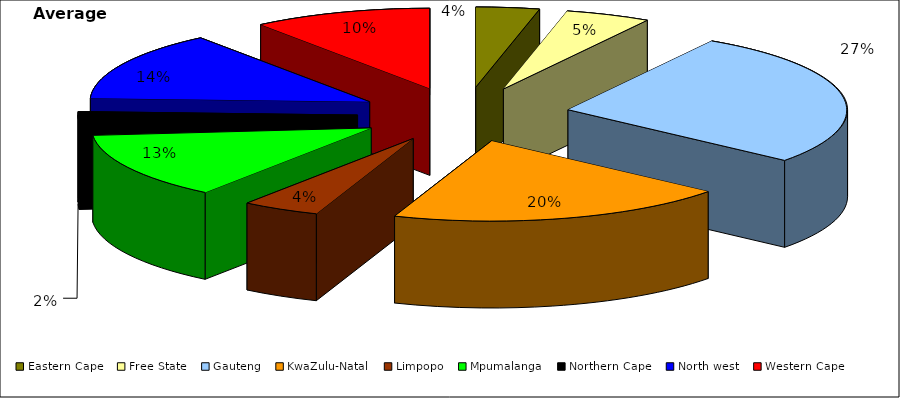
| Category | Average 2002 |
|---|---|
| Eastern Cape | 582.667 |
| Free State | 783.75 |
| Gauteng | 4333.917 |
| KwaZulu-Natal | 3135.75 |
| Limpopo | 714.25 |
| Mpumalanga | 2126.5 |
| Northern Cape | 347.917 |
| North west | 2216.75 |
| Western Cape | 1641.667 |